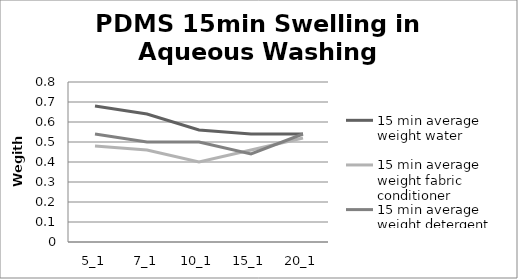
| Category | 15 min average weight water | 15 min average weight fabric conditioner | 15 min average weight detergent |
|---|---|---|---|
| 5_1 | 0.68 | 0.48 | 0.54 |
| 7_1 | 0.64 | 0.46 | 0.5 |
| 10_1 | 0.56 | 0.4 | 0.5 |
| 15_1 | 0.54 | 0.46 | 0.44 |
| 20_1 | 0.54 | 0.52 | 0.54 |